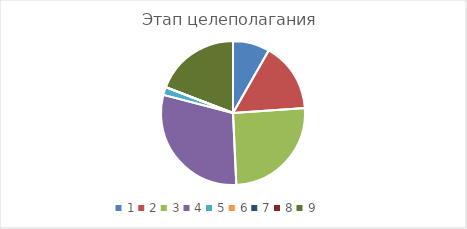
| Category | Series 0 |
|---|---|
| 0 | 0.088 |
| 1 | 0.167 |
| 2 | 0.271 |
| 3 | 0.319 |
| 4 | 0.019 |
| 5 | 0 |
| 6 | 0 |
| 7 | 0 |
| 8 | 0.205 |